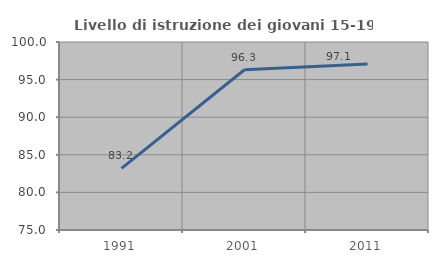
| Category | Livello di istruzione dei giovani 15-19 anni |
|---|---|
| 1991.0 | 83.187 |
| 2001.0 | 96.307 |
| 2011.0 | 97.079 |